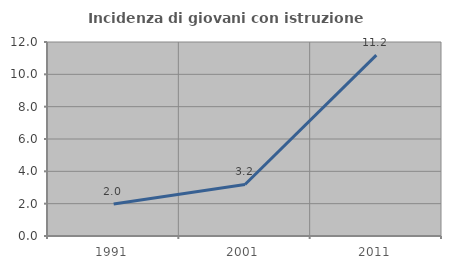
| Category | Incidenza di giovani con istruzione universitaria |
|---|---|
| 1991.0 | 1.977 |
| 2001.0 | 3.186 |
| 2011.0 | 11.187 |